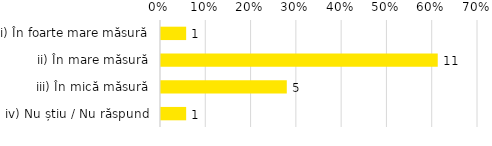
| Category | Total |
|---|---|
| i) În foarte mare măsură | 0.056 |
| ii) În mare măsură | 0.611 |
| iii) În mică măsură | 0.278 |
| iv) Nu știu / Nu răspund | 0.056 |